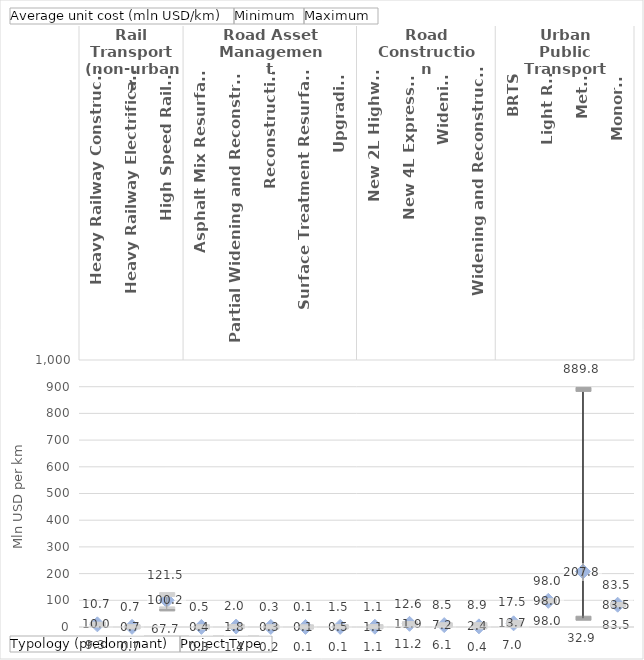
| Category | Average unit cost (mln USD/km) | Minimum | Maximum |
|---|---|---|---|
| 0 | 9.983 | 9.278 | 10.689 |
| 1 | 0.659 | 0.659 | 0.659 |
| 2 | 100.161 | 67.729 | 121.533 |
| 3 | 0.374 | 0.252 | 0.468 |
| 4 | 1.779 | 1.382 | 2.014 |
| 5 | 0.261 | 0.246 | 0.276 |
| 6 | 0.12 | 0.116 | 0.124 |
| 7 | 0.47 | 0.109 | 1.464 |
| 8 | 1.144 | 1.144 | 1.144 |
| 9 | 11.917 | 11.22 | 12.614 |
| 10 | 7.155 | 6.136 | 8.466 |
| 11 | 2.405 | 0.382 | 8.873 |
| 12 | 13.717 | 7.043 | 17.502 |
| 13 | 97.968 | 97.968 | 97.968 |
| 14 | 207.848 | 32.864 | 889.813 |
| 15 | 83.486 | 83.486 | 83.486 |